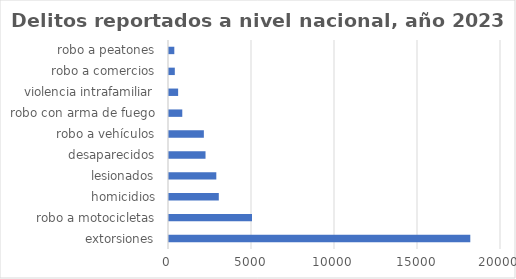
| Category | número |
|---|---|
| extorsiones | 18150 |
| robo a motocicletas | 5000 |
| homicidios | 3000 |
| lesionados | 2850 |
| desaparecidos | 2200 |
| robo a vehículos | 2100 |
| robo con arma de fuego | 800 |
| violencia intrafamiliar | 550 |
| robo a comercios | 350 |
| robo a peatones | 320 |